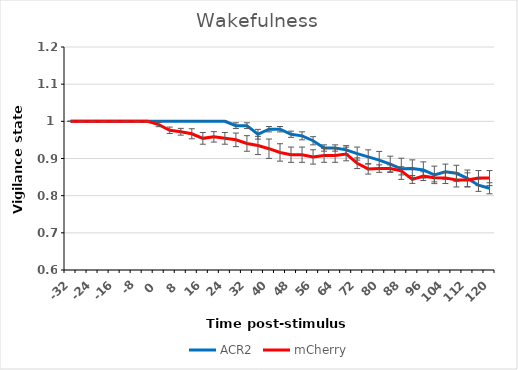
| Category | ACR2 | mCherry |
|---|---|---|
| -32.0 | 1 | 1 |
| -28.0 | 1 | 1 |
| -24.0 | 1 | 1 |
| -20.0 | 1 | 1 |
| -16.0 | 1 | 1 |
| -12.0 | 1 | 1 |
| -8.0 | 1 | 1 |
| -4.0 | 1 | 1 |
| 0.0 | 1 | 0.991 |
| 4.0 | 1 | 0.976 |
| 8.0 | 1 | 0.972 |
| 12.0 | 1 | 0.967 |
| 16.0 | 1 | 0.954 |
| 20.0 | 1 | 0.958 |
| 24.0 | 1 | 0.954 |
| 28.0 | 0.988 | 0.95 |
| 32.0 | 0.988 | 0.94 |
| 36.0 | 0.965 | 0.935 |
| 40.0 | 0.979 | 0.926 |
| 44.0 | 0.979 | 0.916 |
| 48.0 | 0.965 | 0.91 |
| 52.0 | 0.961 | 0.91 |
| 56.0 | 0.948 | 0.904 |
| 60.0 | 0.928 | 0.908 |
| 64.0 | 0.928 | 0.908 |
| 68.0 | 0.923 | 0.912 |
| 72.0 | 0.913 | 0.887 |
| 76.0 | 0.904 | 0.872 |
| 80.0 | 0.896 | 0.873 |
| 84.0 | 0.885 | 0.873 |
| 88.0 | 0.872 | 0.867 |
| 92.0 | 0.873 | 0.844 |
| 96.0 | 0.869 | 0.853 |
| 100.0 | 0.856 | 0.848 |
| 104.0 | 0.864 | 0.848 |
| 108.0 | 0.86 | 0.842 |
| 112.0 | 0.847 | 0.842 |
| 116.0 | 0.828 | 0.847 |
| 120.0 | 0.82 | 0.847 |